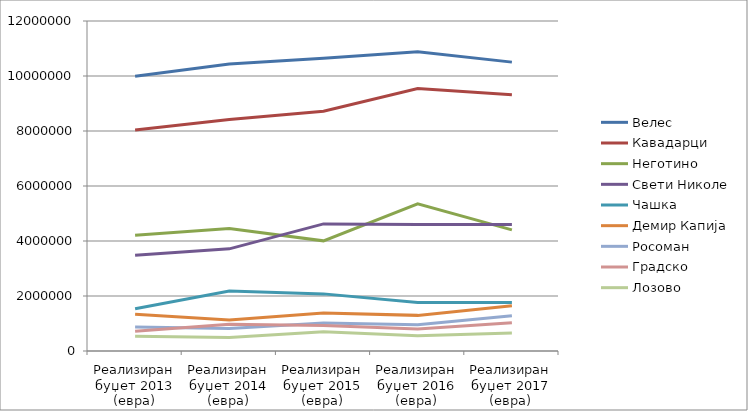
| Category | Велес | Кавадарци | Неготино  | Свети Николе | Чашка | Демир Капија | Росоман | Градско | Лозово |
|---|---|---|---|---|---|---|---|---|---|
| Реализиран буџет 2013 (евра) | 9988768.374 | 8039117.593 | 4210955.496 | 3486195.789 | 1535616.992 | 1339698.195 | 874101.545 | 720864.537 | 538881.268 |
| Реализиран буџет 2014 (евра) | 10436528.602 | 8416874.211 | 4450855.659 | 3714983.171 | 2180011.561 | 1123802.358 | 821757.024 | 976110.569 | 488091.87 |
| Реализиран буџет 2015 (евра) | 10647250.016 | 8717255.886 | 4005316.26 | 4621220.455 | 2077203.008 | 1381381.138 | 1018670.146 | 922862.472 | 703095.154 |
| Реализиран буџет 2016 (евра) | 10885988.309 | 9542717.171 | 5352230.846 | 4604497.171 | 1765999.285 | 1295476.829 | 952132.553 | 800320.911 | 559028.26 |
| Реализиран буџет 2017 (евра) | 10504723.528 | 9319098.992 | 4403908.39 | 4597652.715 | 1762502.195 | 1642359.382 | 1282510.748 | 1024527.024 | 655851.089 |